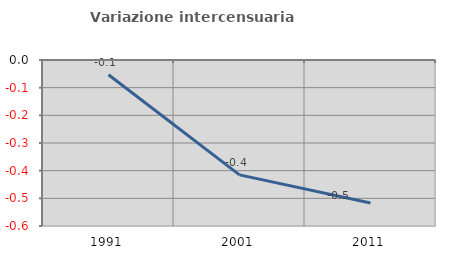
| Category | Variazione intercensuaria annua |
|---|---|
| 1991.0 | -0.054 |
| 2001.0 | -0.415 |
| 2011.0 | -0.517 |